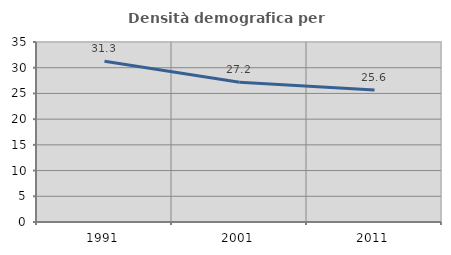
| Category | Densità demografica |
|---|---|
| 1991.0 | 31.268 |
| 2001.0 | 27.169 |
| 2011.0 | 25.647 |